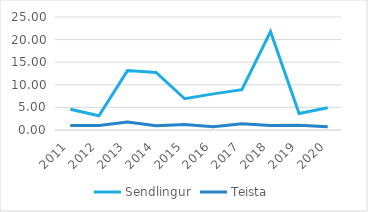
| Category | Sendlingur | Teista |
|---|---|---|
| 2011.0 | 4.59 | 0.99 |
| 2012.0 | 3.139 | 0.982 |
| 2013.0 | 13.141 | 1.791 |
| 2014.0 | 12.722 | 0.918 |
| 2015.0 | 6.916 | 1.226 |
| 2016.0 | 7.992 | 0.709 |
| 2017.0 | 8.91 | 1.393 |
| 2018.0 | 21.765 | 1.008 |
| 2019.0 | 3.661 | 1.057 |
| 2020.0 | 4.94 | 0.728 |